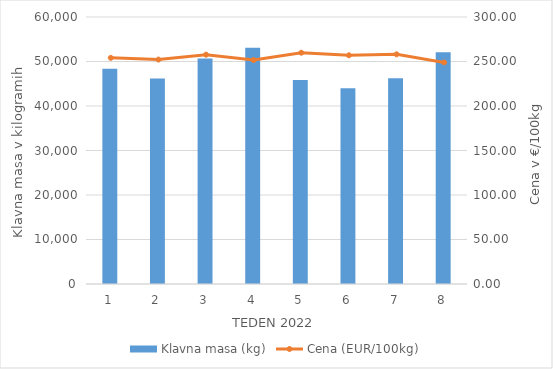
| Category | Klavna masa (kg) |
|---|---|
| 1.0 | 48349 |
| 2.0 | 46187 |
| 3.0 | 50692 |
| 4.0 | 53081 |
| 5.0 | 45844 |
| 6.0 | 43982 |
| 7.0 | 46227 |
| 8.0 | 52099 |